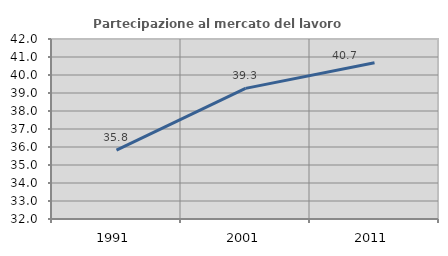
| Category | Partecipazione al mercato del lavoro  femminile |
|---|---|
| 1991.0 | 35.821 |
| 2001.0 | 39.256 |
| 2011.0 | 40.684 |